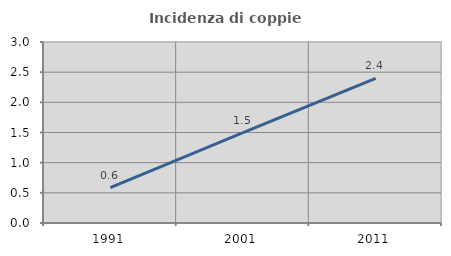
| Category | Incidenza di coppie miste |
|---|---|
| 1991.0 | 0.586 |
| 2001.0 | 1.498 |
| 2011.0 | 2.398 |